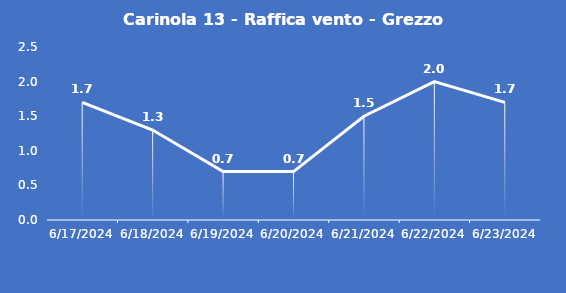
| Category | Carinola 13 - Raffica vento - Grezzo (m/s) |
|---|---|
| 6/17/24 | 1.7 |
| 6/18/24 | 1.3 |
| 6/19/24 | 0.7 |
| 6/20/24 | 0.7 |
| 6/21/24 | 1.5 |
| 6/22/24 | 2 |
| 6/23/24 | 1.7 |